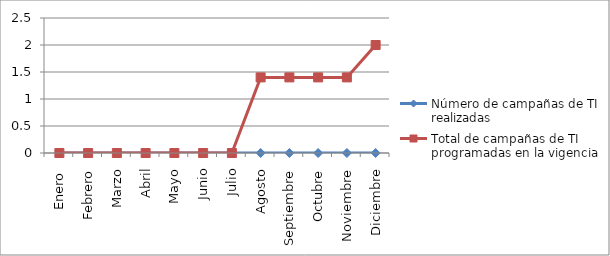
| Category | Número de campañas de TI realizadas  | Total de campañas de TI programadas en la vigencia |
|---|---|---|
| Enero  | 0 | 0 |
| Febrero | 0 | 0 |
| Marzo | 0 | 0 |
| Abril | 0 | 0 |
| Mayo | 0 | 0 |
| Junio | 0 | 0 |
| Julio | 0 | 0 |
| Agosto | 0 | 1.4 |
| Septiembre | 0 | 1.4 |
| Octubre | 0 | 1.4 |
| Noviembre | 0 | 1.4 |
| Diciembre | 0 | 2 |